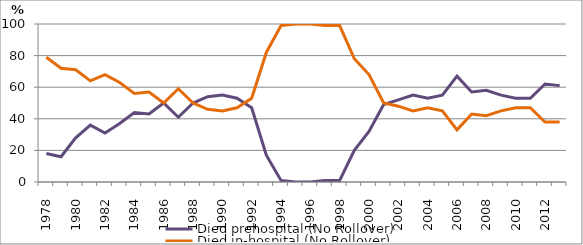
| Category | Died prehospital (No Rollover) | Died in-hospital (No Rollover) |
|---|---|---|
| 1978.0 | 18 | 79 |
| 1979.0 | 16 | 72 |
| 1980.0 | 28 | 71 |
| 1981.0 | 36 | 64 |
| 1982.0 | 31 | 68 |
| 1983.0 | 37 | 63 |
| 1984.0 | 44 | 56 |
| 1985.0 | 43 | 57 |
| 1986.0 | 50 | 50 |
| 1987.0 | 41 | 59 |
| 1988.0 | 50 | 50 |
| 1989.0 | 54 | 46 |
| 1990.0 | 55 | 45 |
| 1991.0 | 53 | 47 |
| 1992.0 | 47 | 53 |
| 1993.0 | 17 | 82 |
| 1994.0 | 1 | 99 |
| 1995.0 | 0 | 100 |
| 1996.0 | 0 | 100 |
| 1997.0 | 1 | 99 |
| 1998.0 | 1 | 99 |
| 1999.0 | 20 | 78 |
| 2000.0 | 32 | 68 |
| 2001.0 | 49 | 50 |
| 2002.0 | 52 | 48 |
| 2003.0 | 55 | 45 |
| 2004.0 | 53 | 47 |
| 2005.0 | 55 | 45 |
| 2006.0 | 67 | 33 |
| 2007.0 | 57 | 43 |
| 2008.0 | 58 | 42 |
| 2009.0 | 55 | 45 |
| 2010.0 | 53 | 47 |
| 2011.0 | 53 | 47 |
| 2012.0 | 62 | 38 |
| 2013.0 | 61 | 38 |